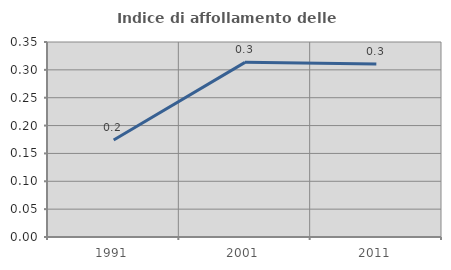
| Category | Indice di affollamento delle abitazioni  |
|---|---|
| 1991.0 | 0.174 |
| 2001.0 | 0.313 |
| 2011.0 | 0.31 |